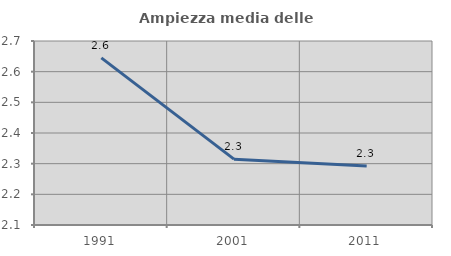
| Category | Ampiezza media delle famiglie |
|---|---|
| 1991.0 | 2.645 |
| 2001.0 | 2.315 |
| 2011.0 | 2.293 |